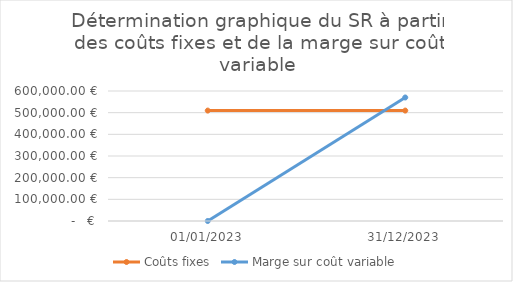
| Category | Coûts fixes | Marge sur coût variable |
|---|---|---|
| 01/01/2023 | 509627 | 0 |
| 31/12/2023 | 509627 | 570082 |